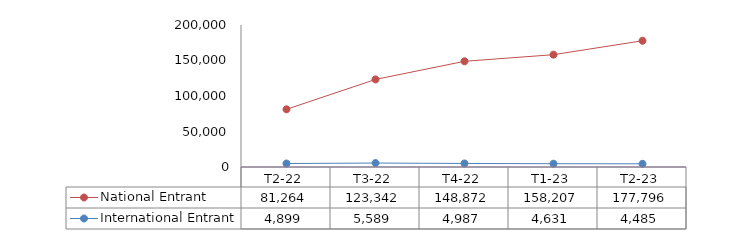
| Category | National Entrant | International Entrant |
|---|---|---|
| T2-22 | 81264.437 | 4898.516 |
| T3-22 | 123341.958 | 5589.489 |
| T4-22 | 148872.488 | 4987.187 |
| T1-23 | 158206.927 | 4630.797 |
| T2-23 | 177796.33 | 4485.114 |